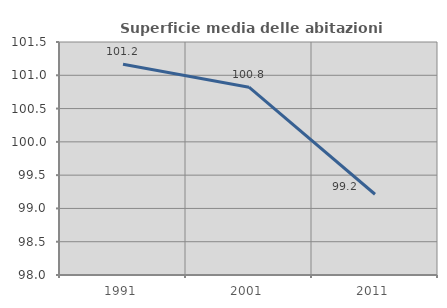
| Category | Superficie media delle abitazioni occupate |
|---|---|
| 1991.0 | 101.166 |
| 2001.0 | 100.821 |
| 2011.0 | 99.213 |